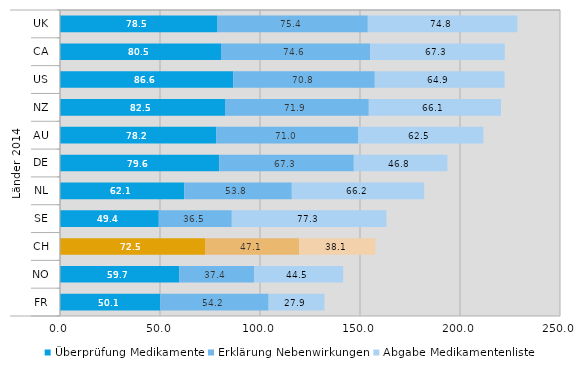
| Category | Überprüfung Medikamente | Erklärung Nebenwirkungen | Abgabe Medikamentenliste |
|---|---|---|---|
| 0 | 78.5 | 75.4 | 74.8 |
| 1 | 80.5 | 74.6 | 67.3 |
| 2 | 86.6 | 70.8 | 64.9 |
| 3 | 82.5 | 71.9 | 66.1 |
| 4 | 78.2 | 71 | 62.5 |
| 5 | 79.6 | 67.3 | 46.8 |
| 6 | 62.1 | 53.8 | 66.2 |
| 7 | 49.4 | 36.5 | 77.3 |
| 8 | 72.5 | 47.1 | 38.1 |
| 9 | 59.7 | 37.4 | 44.5 |
| 10 | 50.1 | 54.2 | 27.9 |